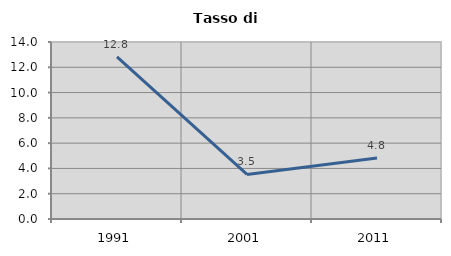
| Category | Tasso di disoccupazione   |
|---|---|
| 1991.0 | 12.821 |
| 2001.0 | 3.526 |
| 2011.0 | 4.817 |